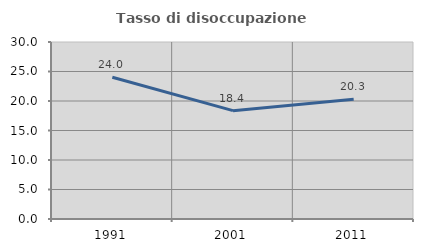
| Category | Tasso di disoccupazione giovanile  |
|---|---|
| 1991.0 | 24.022 |
| 2001.0 | 18.367 |
| 2011.0 | 20.312 |